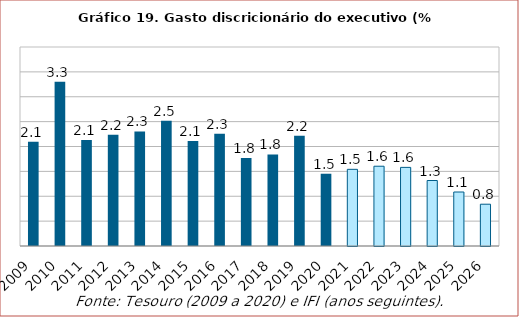
| Category | Gastos discricionários |
|---|---|
| 2009.0 | 2.095 |
| 2010.0 | 3.301 |
| 2011.0 | 2.132 |
| 2012.0 | 2.238 |
| 2013.0 | 2.303 |
| 2014.0 | 2.516 |
| 2015.0 | 2.11 |
| 2016.0 | 2.255 |
| 2017.0 | 1.768 |
| 2018.0 | 1.839 |
| 2019.0 | 2.217 |
| 2020.0 | 1.453 |
| 2021.0 | 1.541 |
| 2022.0 | 1.604 |
| 2023.0 | 1.58 |
| 2024.0 | 1.316 |
| 2025.0 | 1.085 |
| 2026.0 | 0.84 |